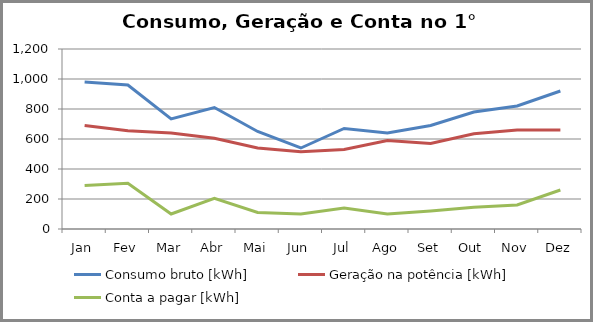
| Category | Consumo bruto [kWh] | Geração na potência [kWh] | Conta a pagar [kWh] |
|---|---|---|---|
| Jan | 980 | 690 | 290 |
| Fev | 960 | 655 | 305 |
| Mar | 734 | 640 | 100 |
| Abr | 810 | 605 | 205 |
| Mai | 650 | 540 | 110 |
| Jun | 540 | 515 | 100 |
| Jul | 670 | 530 | 140 |
| Ago | 640 | 590 | 100 |
| Set | 690 | 570 | 120 |
| Out | 780 | 635 | 145 |
| Nov | 820 | 660 | 160 |
| Dez | 920 | 660 | 260 |